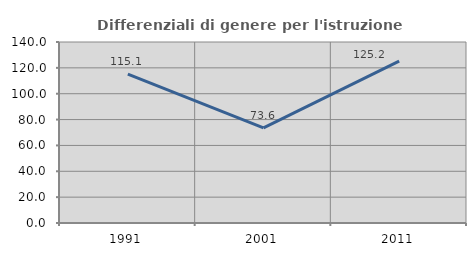
| Category | Differenziali di genere per l'istruzione superiore |
|---|---|
| 1991.0 | 115.127 |
| 2001.0 | 73.558 |
| 2011.0 | 125.184 |